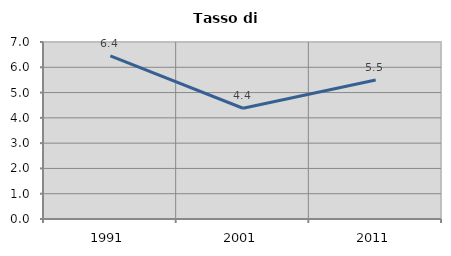
| Category | Tasso di disoccupazione   |
|---|---|
| 1991.0 | 6.45 |
| 2001.0 | 4.38 |
| 2011.0 | 5.497 |